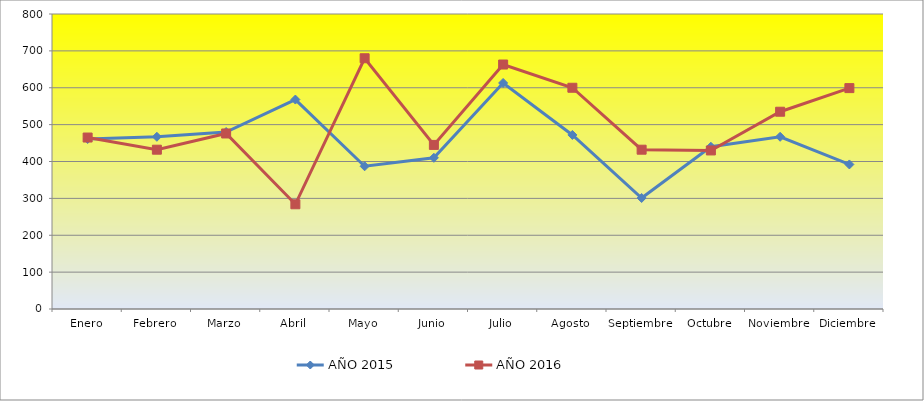
| Category | AÑO 2015 | AÑO 2016 |
|---|---|---|
| Enero | 461 | 465 |
| Febrero | 467 | 432 |
| Marzo | 480 | 476 |
| Abril | 568 | 284 |
| Mayo | 387 | 680 |
| Junio | 410 | 445 |
| Julio | 613 | 663 |
| Agosto | 472 | 600 |
| Septiembre | 301 | 432 |
| Octubre | 440 | 430 |
| Noviembre | 467 | 535 |
| Diciembre | 392 | 599 |